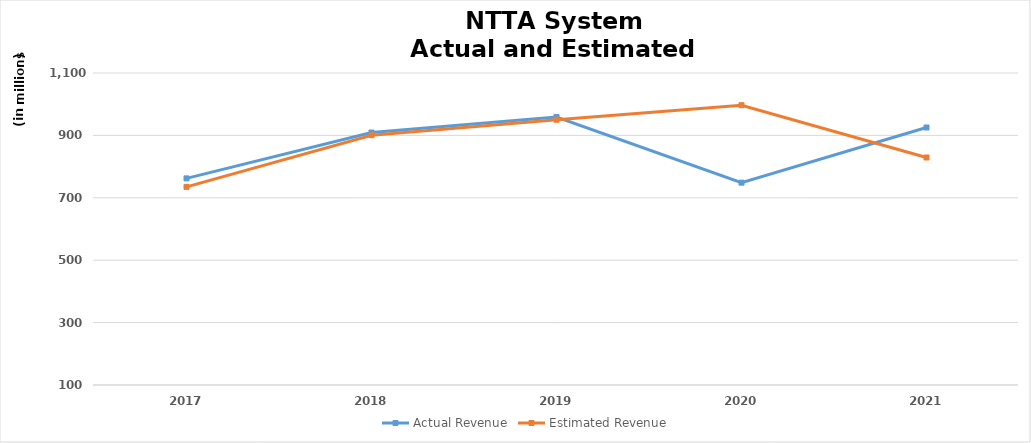
| Category | Actual Revenue | Estimated Revenue |
|---|---|---|
| 2017.0 | 762.164 | 735.088 |
| 2018.0 | 909.184 | 900.534 |
| 2019.0 | 959.032 | 950.239 |
| 2020.0 | 748.579 | 996.778 |
| 2021.0 | 925.283 | 829.204 |